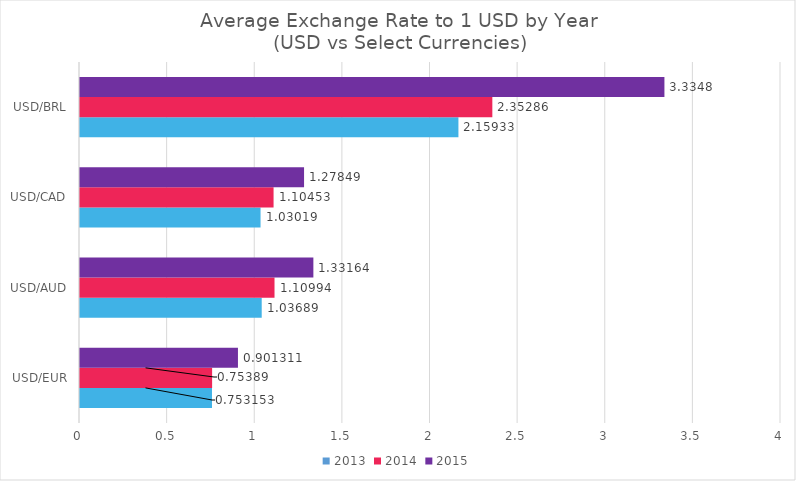
| Category | 2013 | 2014 | 2015 |
|---|---|---|---|
| USD/EUR | 0.753 | 0.754 | 0.901 |
| USD/AUD | 1.037 | 1.11 | 1.332 |
| USD/CAD | 1.03 | 1.105 | 1.278 |
| USD/BRL | 2.159 | 2.353 | 3.335 |